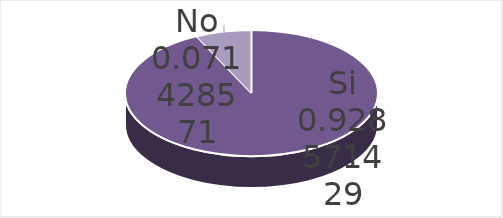
| Category | Series 0 |
|---|---|
| Si | 13 |
| No | 1 |